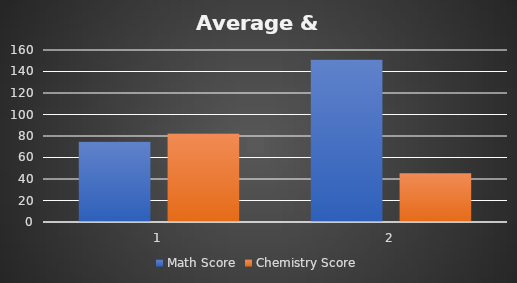
| Category | Math Score | Chemistry Score |
|---|---|---|
| 0 | 74.625 | 82.25 |
| 1 | 151.125 | 45.357 |